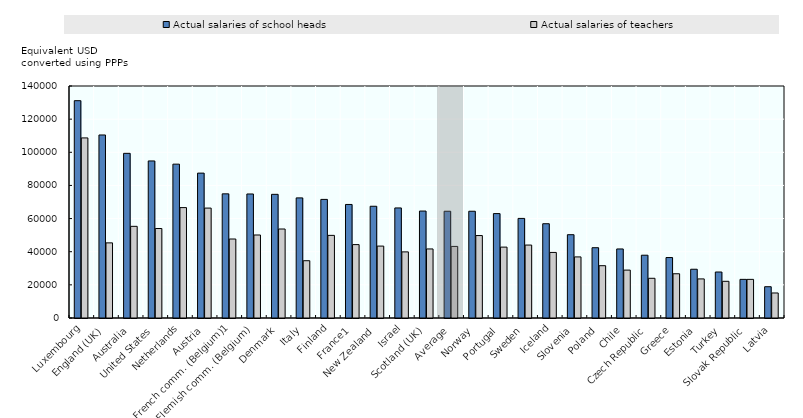
| Category | Actual salaries of school heads | Actual salaries of teachers |
|---|---|---|
| Luxembourg | 131143.99 | 108673.091 |
| England (UK) | 110441.92 | 45343.053 |
| Australia | 99364.126 | 55312.717 |
| United States | 94775 | 54000 |
| Netherlands | 92837.015 | 66617.097 |
| Austria | 87432.17 | 66328.866 |
| French comm. (Belgium)1 | 74926.734 | 47664.427 |
| Flemish comm. (Belgium) | 74846.236 | 50089.602 |
| Denmark | 74627.624 | 53702.731 |
| Italy | 72478.306 | 34567.766 |
| Finland | 71567.464 | 49860.166 |
| France1 | 68517.055 | 44294.483 |
| New Zealand | 67435.181 | 43397.469 |
| Israel | 66412.591 | 39896.742 |
| Scotland (UK) | 64538.696 | 41669.696 |
| Average | 64423.316 | 43202.29 |
| Norway | 64420.876 | 49752.758 |
| Portugal | 63006.35 | 42770.108 |
| Sweden | 60096.526 | 44016.392 |
| Iceland | 56884.916 | 39571.567 |
| Slovenia | 50269.209 | 36864.087 |
| Poland | 42416.667 | 31567.41 |
| Chile | 41666.139 | 28901.243 |
| Czech Republic | 37888.44 | 23966.475 |
| Greece | 36484.146 | 26697.49 |
| Estonia | 29420.725 | 23583.804 |
| Turkey | 27757.21 | 22142.913 |
| Slovak Republic | 23315.716 | 23315.716 |
| Latvia | 18881.826 | 15096.242 |